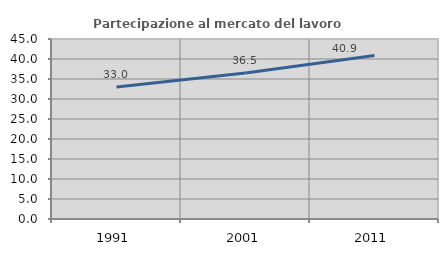
| Category | Partecipazione al mercato del lavoro  femminile |
|---|---|
| 1991.0 | 33.027 |
| 2001.0 | 36.523 |
| 2011.0 | 40.851 |